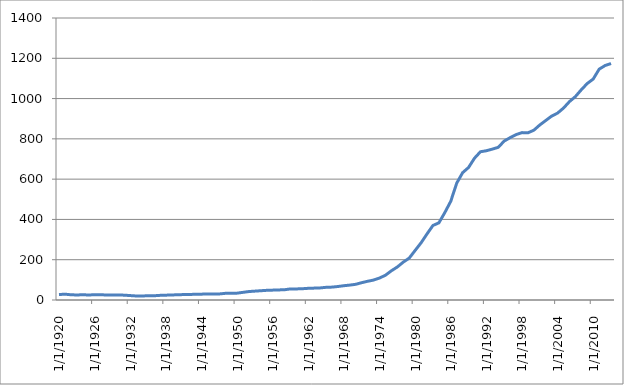
| Category | Series 0 |
|---|---|
| 1/1/20 | 27 |
| 1/1/21 | 29 |
| 1/1/22 | 26 |
| 1/1/23 | 25 |
| 1/1/24 | 26 |
| 1/1/25 | 25 |
| 1/1/26 | 26 |
| 1/1/27 | 26 |
| 1/1/28 | 25 |
| 1/1/29 | 25 |
| 1/1/30 | 25 |
| 1/1/31 | 24 |
| 1/1/32 | 22 |
| 1/1/33 | 20 |
| 1/1/34 | 20 |
| 1/1/35 | 21 |
| 1/1/36 | 21 |
| 1/1/37 | 23 |
| 1/1/38 | 24 |
| 1/1/39 | 25 |
| 1/1/40 | 26 |
| 1/1/41 | 27 |
| 1/1/42 | 27 |
| 1/1/43 | 29 |
| 1/1/44 | 29 |
| 1/1/45 | 30 |
| 1/1/46 | 30 |
| 1/1/47 | 30 |
| 1/1/48 | 33 |
| 1/1/49 | 34 |
| 1/1/50 | 34 |
| 1/1/51 | 38 |
| 1/1/52 | 42 |
| 1/1/53 | 44 |
| 1/1/54 | 46 |
| 1/1/55 | 48 |
| 1/1/56 | 49 |
| 1/1/57 | 50 |
| 1/1/58 | 51 |
| 1/1/59 | 55 |
| 1/1/60 | 55 |
| 1/1/61 | 56 |
| 1/1/62 | 58 |
| 1/1/63 | 59 |
| 1/1/64 | 60 |
| 1/1/65 | 63 |
| 1/1/66 | 64 |
| 1/1/67 | 67 |
| 1/1/68 | 71 |
| 1/1/69 | 74 |
| 1/1/70 | 78 |
| 1/1/71 | 86 |
| 1/1/72 | 93 |
| 1/1/73 | 99 |
| 1/1/74 | 109 |
| 1/1/75 | 123 |
| 1/1/76 | 145 |
| 1/1/77 | 164 |
| 1/1/78 | 188 |
| 1/1/79 | 208 |
| 1/1/80 | 246 |
| 1/1/81 | 284 |
| 1/1/82 | 328 |
| 1/1/83 | 370 |
| 1/1/84 | 383 |
| 1/1/85 | 434 |
| 1/1/86 | 490 |
| 1/1/87 | 580 |
| 1/1/88 | 632 |
| 1/1/89 | 658 |
| 1/1/90 | 704 |
| 1/1/91 | 736 |
| 1/1/92 | 741 |
| 1/1/93 | 749 |
| 1/1/94 | 758 |
| 1/1/95 | 789 |
| 1/1/96 | 806 |
| 1/1/97 | 821 |
| 1/1/98 | 831 |
| 1/1/99 | 830 |
| 1/1/00 | 843 |
| 1/1/01 | 869 |
| 1/1/02 | 891 |
| 1/1/03 | 913 |
| 1/1/04 | 928 |
| 1/1/05 | 953 |
| 1/1/06 | 985 |
| 1/1/07 | 1010 |
| 1/1/08 | 1044 |
| 1/1/09 | 1075 |
| 1/1/10 | 1097 |
| 1/1/11 | 1146 |
| 1/1/12 | 1164 |
| 1/1/13 | 1174 |